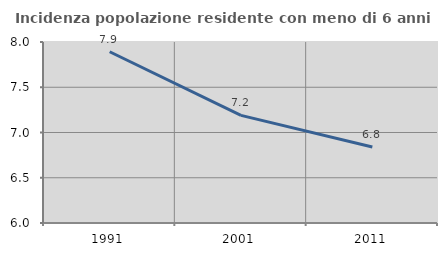
| Category | Incidenza popolazione residente con meno di 6 anni |
|---|---|
| 1991.0 | 7.892 |
| 2001.0 | 7.189 |
| 2011.0 | 6.84 |